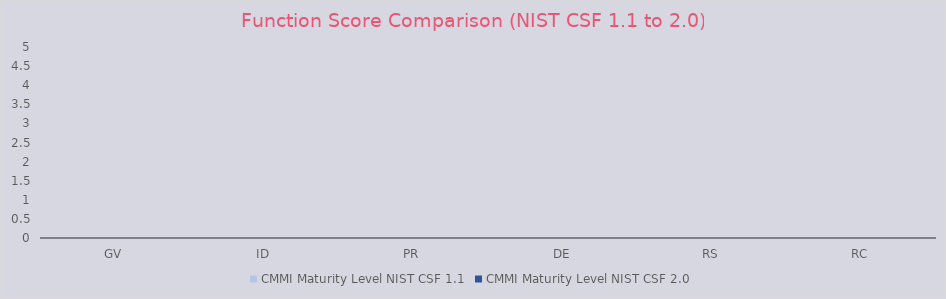
| Category | CMMI Maturity Level |
|---|---|
| GV | 0 |
| ID | 0 |
| PR | 0 |
| DE | 0 |
| RS | 0 |
| RC | 0 |